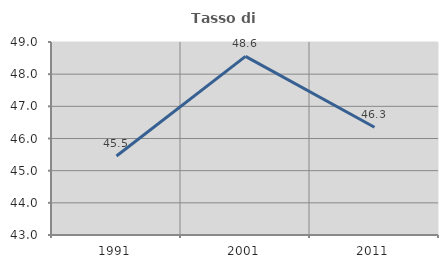
| Category | Tasso di occupazione   |
|---|---|
| 1991.0 | 45.455 |
| 2001.0 | 48.551 |
| 2011.0 | 46.349 |